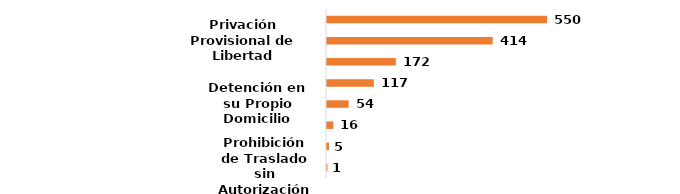
| Category | Series 0 |
|---|---|
| Prohibición de Traslado sin Autorización | 0.001 |
| Prohibición de Visitar Determinadas Personas | 0.004 |
| Cambio de Residencia | 0.012 |
| Detención en su Propio Domicilio | 0.041 |
| Libertad sin Medida Cautelar | 0.088 |
| Poner Bajo Custodia de otra Persona o Institución | 0.129 |
| Privación Provisional de Libertad | 0.312 |
| Obligación de Presentarse ante una Autoridad | 0.414 |